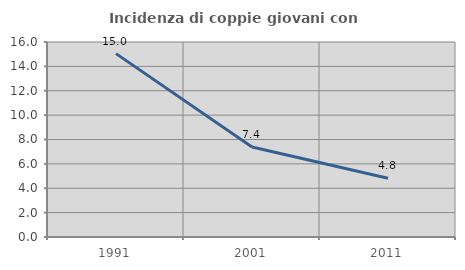
| Category | Incidenza di coppie giovani con figli |
|---|---|
| 1991.0 | 15.047 |
| 2001.0 | 7.384 |
| 2011.0 | 4.813 |